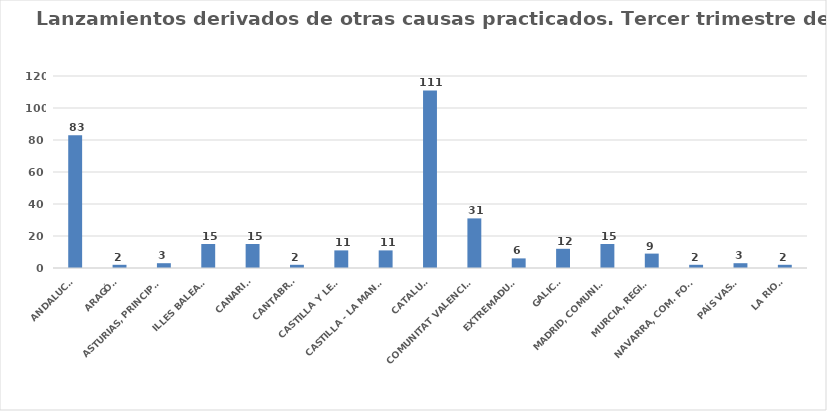
| Category | Series 0 |
|---|---|
| ANDALUCÍA | 83 |
| ARAGÓN | 2 |
| ASTURIAS, PRINCIPADO | 3 |
| ILLES BALEARS | 15 |
| CANARIAS | 15 |
| CANTABRIA | 2 |
| CASTILLA Y LEÓN | 11 |
| CASTILLA - LA MANCHA | 11 |
| CATALUÑA | 111 |
| COMUNITAT VALENCIANA | 31 |
| EXTREMADURA | 6 |
| GALICIA | 12 |
| MADRID, COMUNIDAD | 15 |
| MURCIA, REGIÓN | 9 |
| NAVARRA, COM. FORAL | 2 |
| PAÍS VASCO | 3 |
| LA RIOJA | 2 |